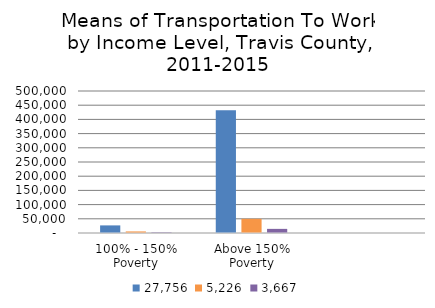
| Category |  27,756  |  5,226  |  3,667  |
|---|---|---|---|
| 100% - 150% Poverty | 26782.415 | 5529.706 | 2179.911 |
| Above 150% Poverty | 432414.264 | 50010.418 | 14525.949 |